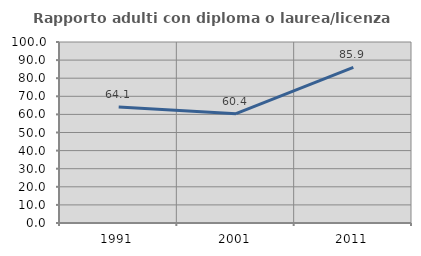
| Category | Rapporto adulti con diploma o laurea/licenza media  |
|---|---|
| 1991.0 | 64.103 |
| 2001.0 | 60.417 |
| 2011.0 | 85.938 |